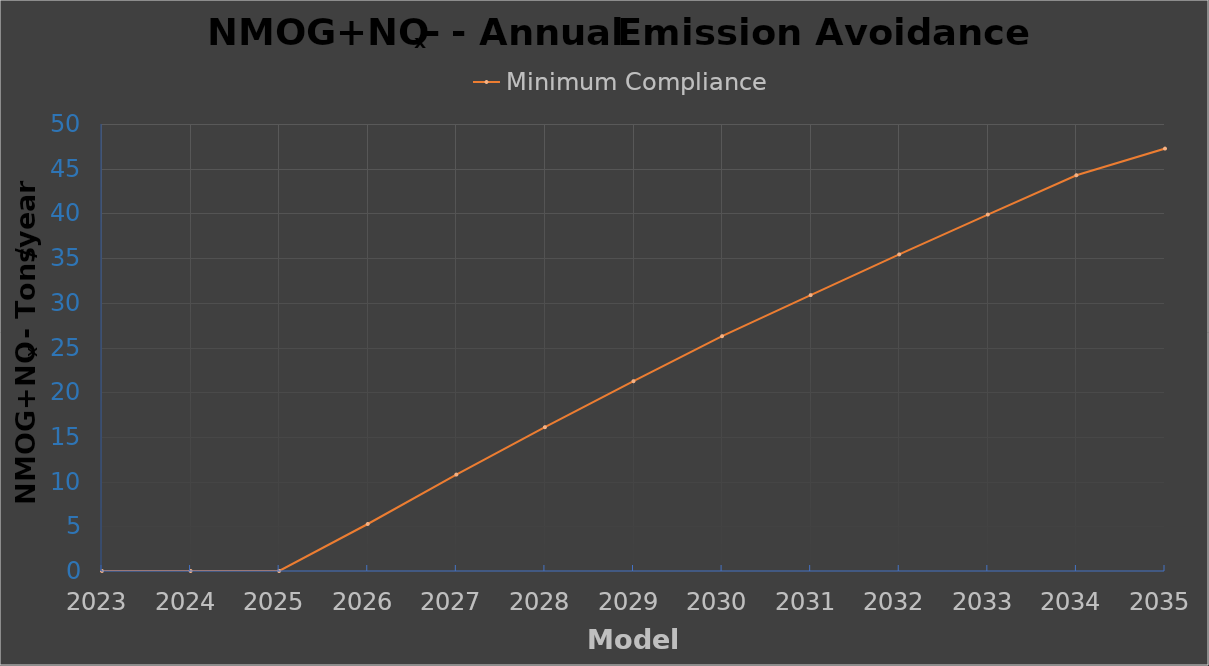
| Category | Minimum Compliance |
|---|---|
| 2023.0 | 0 |
| 2024.0 | 0 |
| 2025.0 | 0 |
| 2026.0 | 5.258 |
| 2027.0 | 10.786 |
| 2028.0 | 16.086 |
| 2029.0 | 21.227 |
| 2030.0 | 26.263 |
| 2031.0 | 30.859 |
| 2032.0 | 35.413 |
| 2033.0 | 39.872 |
| 2034.0 | 44.269 |
| 2035.0 | 47.249 |